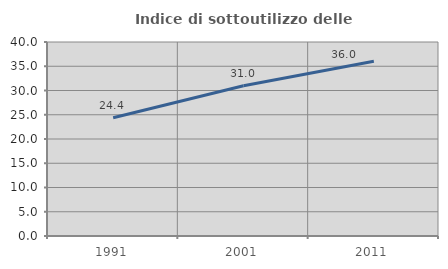
| Category | Indice di sottoutilizzo delle abitazioni  |
|---|---|
| 1991.0 | 24.374 |
| 2001.0 | 30.963 |
| 2011.0 | 36.038 |